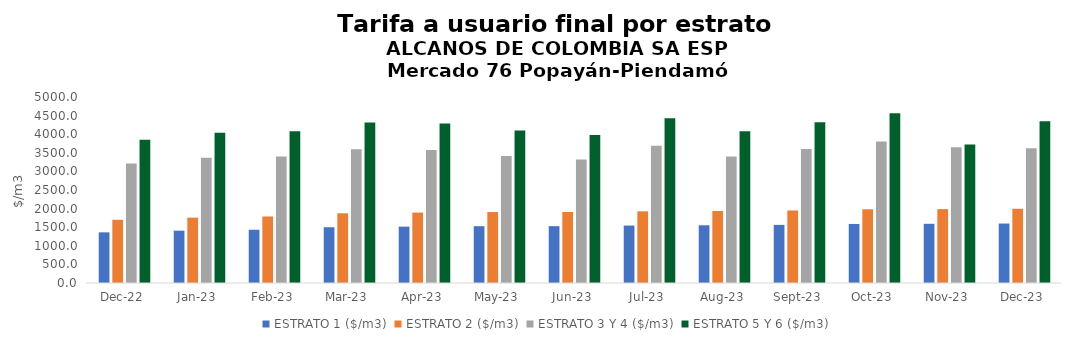
| Category | ESTRATO 1 ($/m3) | ESTRATO 2 ($/m3) | ESTRATO 3 Y 4 ($/m3) | ESTRATO 5 Y 6 ($/m3) |
|---|---|---|---|---|
| 2022-12-01 | 1361.48 | 1700.11 | 3209.93 | 3851.916 |
| 2023-01-01 | 1406.32 | 1756.53 | 3365.49 | 4038.588 |
| 2023-02-01 | 1431.45 | 1787.62 | 3398.26 | 4077.912 |
| 2023-03-01 | 1499.4 | 1873.1 | 3596.1 | 4315.32 |
| 2023-04-01 | 1515.22 | 1892.7 | 3575.22 | 4290.264 |
| 2023-05-01 | 1527.06 | 1907.55 | 3416.65 | 4099.98 |
| 2023-06-01 | 1528.08 | 1909 | 3316.57 | 3979.884 |
| 2023-07-01 | 1543.84 | 1926.61 | 3689.81 | 4427.772 |
| 2023-08-01 | 1551.43 | 1936.32 | 3401.48 | 4081.776 |
| 2023-09-01 | 1562.51 | 1949.77 | 3603.59 | 4324.308 |
| 2023-10-01 | 1587.1 | 1981.56 | 3805.44 | 4566.528 |
| 2023-11-01 | 1591.15 | 1986.35 | 3648.51 | 3721.48 |
| 2023-12-01 | 1598.38 | 1995.68 | 3624.28 | 4349.136 |